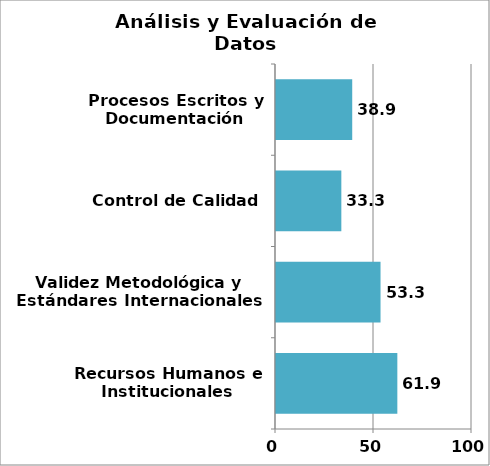
| Category | Series 0 |
|---|---|
| Recursos Humanos e Institucionales | 61.905 |
| Validez Metodológica y Estándares Internacionales | 53.333 |
| Control de Calidad | 33.333 |
| Procesos Escritos y Documentación | 38.889 |